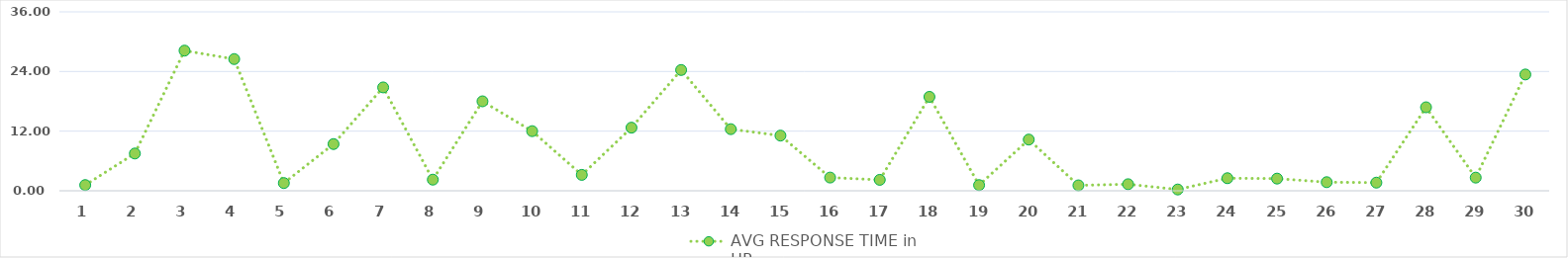
| Category | AVG RESPONSE TIME in HR |
|---|---|
| 0 | 1.15 |
| 1 | 7.5 |
| 2 | 28.2 |
| 3 | 26.5 |
| 4 | 1.55 |
| 5 | 9.4 |
| 6 | 20.8 |
| 7 | 2.24 |
| 8 | 18 |
| 9 | 12 |
| 10 | 3.2 |
| 11 | 12.7 |
| 12 | 24.3 |
| 13 | 12.4 |
| 14 | 11.1 |
| 15 | 2.66 |
| 16 | 2.2 |
| 17 | 18.9 |
| 18 | 1.14 |
| 19 | 10.3 |
| 20 | 1.09 |
| 21 | 1.32 |
| 22 | 0.26 |
| 23 | 2.53 |
| 24 | 2.45 |
| 25 | 1.73 |
| 26 | 1.64 |
| 27 | 16.8 |
| 28 | 2.65 |
| 29 | 23.4 |